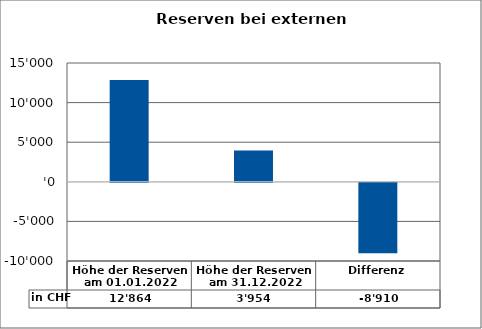
| Category | in CHF |
|---|---|
| Höhe der Reserven am 01.01.2022 | 12863.741 |
| Höhe der Reserven am 31.12.2022 | 3953.68 |
| Differenz | -8910.061 |